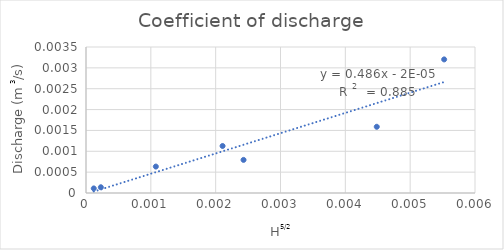
| Category | QA (m3/s) |
|---|---|
| 0.002429999999999999 | 0.001 |
| 0.001077167872246475 | 0.001 |
| 0.0001197869233263797 | 0 |
| 0.002106431372012865 | 0.001 |
| 0.005524271728019904 | 0.003 |
| 0.0002291765149399039 | 0 |
| 0.004484815701341582 | 0.002 |